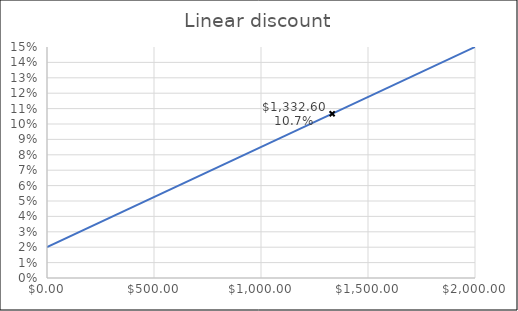
| Category | Series 0 |
|---|---|
| 0.0 | 0.02 |
| 2000.0 | 0.15 |